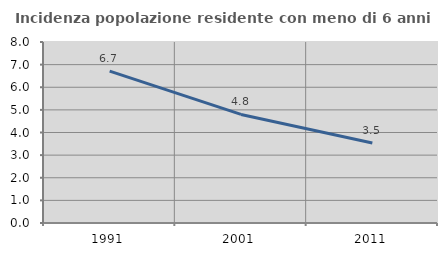
| Category | Incidenza popolazione residente con meno di 6 anni |
|---|---|
| 1991.0 | 6.714 |
| 2001.0 | 4.799 |
| 2011.0 | 3.535 |